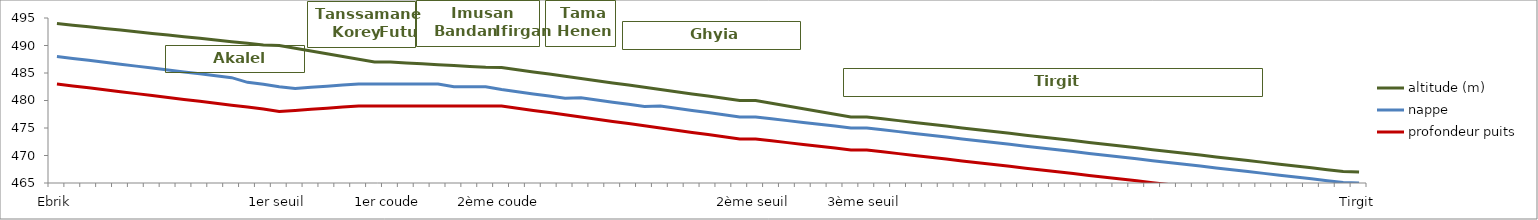
| Category | altitude (m) | nappe | profondeur puits |
|---|---|---|---|
| Ebrik | 494 | 488 | 483 |
|  | 493.7 | 487.65 | 482.65 |
|  | 493.4 | 487.3 | 482.3 |
|  | 493.1 | 486.95 | 481.95 |
|  | 492.8 | 486.6 | 481.6 |
|  | 492.5 | 486.25 | 481.25 |
|  | 492.2 | 485.9 | 480.9 |
|  | 491.9 | 485.55 | 480.55 |
|  | 491.6 | 485.2 | 480.2 |
|  | 491.3 | 484.85 | 479.85 |
|  | 491 | 484.5 | 479.5 |
|  | 490.7 | 484.15 | 479.15 |
|  | 490.4 | 483.3 | 478.8 |
|  | 490.1 | 482.95 | 478.45 |
| 1er seuil | 490 | 482.5 | 478 |
|  | 489.5 | 482.2 | 478.2 |
|  | 489 | 482.4 | 478.4 |
|  | 488.5 | 482.6 | 478.6 |
|  | 488 | 482.8 | 478.8 |
|  | 487.5 | 483 | 479 |
|  | 487 | 483 | 479 |
| 1er coude | 487 | 483 | 479 |
|  | 486.84 | 483 | 479 |
|  | 486.68 | 483 | 479 |
|  | 486.52 | 483 | 479 |
|  | 486.36 | 482.5 | 479 |
|  | 486.2 | 482.5 | 479 |
|  | 486.04 | 482.5 | 479 |
| 2ème coude | 486 | 482 | 479 |
|  | 485.6 | 481.6 | 478.6 |
|  | 485.2 | 481.2 | 478.2 |
|  | 484.8 | 480.8 | 477.8 |
|  | 484.4 | 480.4 | 477.4 |
|  | 484 | 480.5 | 477 |
|  | 483.6 | 480.1 | 476.6 |
|  | 483.2 | 479.7 | 476.2 |
|  | 482.8 | 479.3 | 475.8 |
|  | 482.4 | 478.9 | 475.4 |
|  | 482 | 479 | 475 |
|  | 481.6 | 478.6 | 474.6 |
|  | 481.2 | 478.2 | 474.2 |
|  | 480.8 | 477.8 | 473.8 |
|  | 480.4 | 477.4 | 473.4 |
|  | 480 | 477 | 473 |
| 2ème seuil | 480 | 477 | 473 |
|  | 479.5 | 476.67 | 472.67 |
|  | 479 | 476.34 | 472.34 |
|  | 478.5 | 476.01 | 472.01 |
|  | 478 | 475.68 | 471.68 |
|  | 477.5 | 475.35 | 471.35 |
|  | 477 | 475.02 | 471.02 |
| 3ème seuil | 477 | 475 | 471 |
|  | 476.67 | 474.67 | 470.67 |
|  | 476.34 | 474.34 | 470.34 |
|  | 476.01 | 474.01 | 470.01 |
|  | 475.68 | 473.68 | 469.68 |
|  | 475.35 | 473.35 | 469.35 |
|  | 475.02 | 473.02 | 469.02 |
|  | 474.69 | 472.69 | 468.69 |
|  | 474.36 | 472.36 | 468.36 |
|  | 474.03 | 472.03 | 468.03 |
|  | 473.7 | 471.7 | 467.7 |
|  | 473.37 | 471.37 | 467.37 |
|  | 473.04 | 471.04 | 467.04 |
|  | 472.71 | 470.71 | 466.71 |
|  | 472.38 | 470.38 | 466.38 |
|  | 472.05 | 470.05 | 466.05 |
|  | 471.72 | 469.72 | 465.72 |
|  | 471.39 | 469.39 | 465.39 |
|  | 471.06 | 469.06 | 465.06 |
|  | 470.73 | 468.73 | 464.73 |
|  | 470.4 | 468.4 | 464.4 |
|  | 470.07 | 468.07 | 464.07 |
|  | 469.74 | 467.74 | 463.74 |
|  | 469.41 | 467.41 | 463.41 |
|  | 469.08 | 467.08 | 463.08 |
|  | 468.75 | 466.75 | 462.75 |
|  | 468.42 | 466.42 | 462.42 |
|  | 468.09 | 466.09 | 462.09 |
|  | 467.76 | 465.76 | 461.76 |
|  | 467.43 | 465.43 | 461.43 |
|  | 467.1 | 465.1 | 461.1 |
| Tirgit | 467 | 465 | 461 |